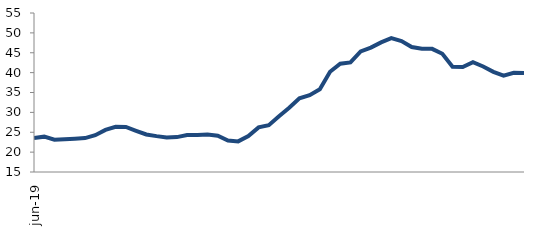
| Category | Series 0 |
|---|---|
| 2019-06-01 | 23.564 |
| 2019-07-01 | 23.893 |
| 2019-08-01 | 23.133 |
| 2019-09-01 | 23.263 |
| 2019-10-01 | 23.369 |
| 2019-11-01 | 23.525 |
| 2019-12-01 | 24.256 |
| 2020-01-01 | 25.597 |
| 2020-02-01 | 26.375 |
| 2020-03-01 | 26.322 |
| 2020-04-01 | 25.369 |
| 2020-05-01 | 24.446 |
| 2020-06-01 | 24.028 |
| 2020-07-01 | 23.685 |
| 2020-08-01 | 23.782 |
| 2020-09-01 | 24.28 |
| 2020-10-01 | 24.323 |
| 2020-11-01 | 24.433 |
| 2020-12-01 | 24.131 |
| 2021-01-01 | 22.928 |
| 2021-02-01 | 22.701 |
| 2021-03-01 | 24.039 |
| 2021-04-01 | 26.229 |
| 2021-05-01 | 26.758 |
| 2021-06-01 | 29.013 |
| 2021-07-01 | 31.153 |
| 2021-08-01 | 33.54 |
| 2021-09-01 | 34.33 |
| 2021-10-01 | 35.804 |
| 2021-11-01 | 40.209 |
| 2021-12-01 | 42.248 |
| 2022-01-01 | 42.562 |
| 2022-02-01 | 45.314 |
| 2022-03-01 | 46.285 |
| 2022-04-01 | 47.614 |
| 2022-05-01 | 48.674 |
| 2022-06-01 | 47.931 |
| 2022-07-01 | 46.442 |
| 2022-08-01 | 46 |
| 2022-09-01 | 45.983 |
| 2022-10-01 | 44.739 |
| 2022-11-01 | 41.492 |
| 2022-12-01 | 41.391 |
| 2023-01-01 | 42.634 |
| 2023-02-01 | 41.54 |
| 2023-03-01 | 40.198 |
| 2023-04-01 | 39.238 |
| 2023-05-01 | 39.944 |
| 2023-06-01 | 39.891 |